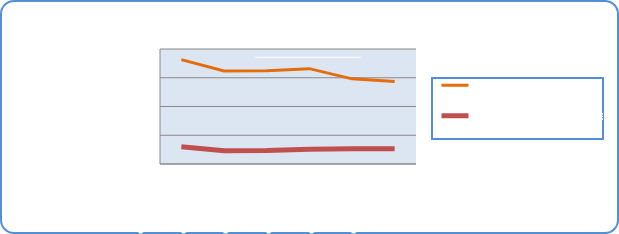
| Category | Motorin Türleri | Benzin Türleri |
|---|---|---|
| 8/26/19 | 72643668.129 | 12002300.384 |
| 8/27/19 | 64655272.893 | 9221830.135 |
| 8/28/19 | 64865950.986 | 9347481.308 |
| 8/29/19 | 66335592.092 | 10294030.705 |
| 8/30/19 | 59226624.63 | 10647550.492 |
| 8/31/19 | 57393050.498 | 10583370.119 |